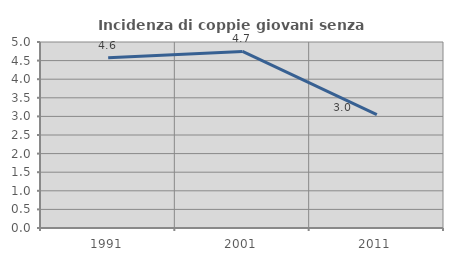
| Category | Incidenza di coppie giovani senza figli |
|---|---|
| 1991.0 | 4.578 |
| 2001.0 | 4.746 |
| 2011.0 | 3.048 |